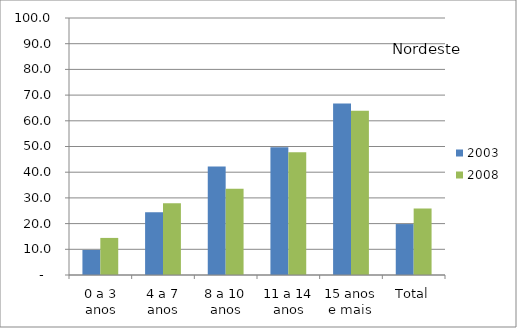
| Category | 2003 | 2008 |
|---|---|---|
| 0 a 3 anos | 9.75 | 14.43 |
| 4 a 7 anos | 24.44 | 27.9 |
| 8 a 10 anos | 42.23 | 33.55 |
| 11 a 14 anos | 49.71 | 47.73 |
| 15 anos e mais | 66.78 | 63.89 |
| Total | 19.82 | 25.85 |